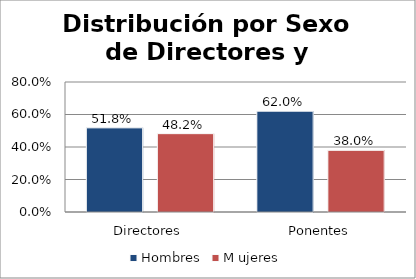
| Category | Hombres | M ujeres |
|---|---|---|
| Directores | 0.518 | 0.482 |
| Ponentes | 0.62 | 0.38 |